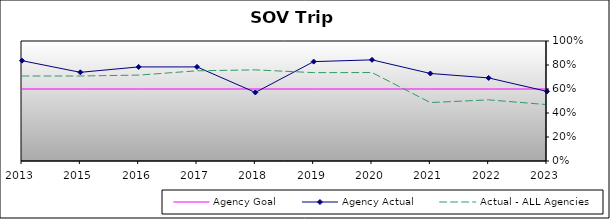
| Category | Agency Goal | Agency Actual | Actual - ALL Agencies |
|---|---|---|---|
| 2013.0 | 0.6 | 0.836 | 0.708 |
| 2015.0 | 0.6 | 0.739 | 0.708 |
| 2016.0 | 0.6 | 0.784 | 0.716 |
| 2017.0 | 0.6 | 0.784 | 0.752 |
| 2018.0 | 0.6 | 0.571 | 0.759 |
| 2019.0 | 0.6 | 0.828 | 0.736 |
| 2020.0 | 0.6 | 0.843 | 0.737 |
| 2021.0 | 0.6 | 0.729 | 0.487 |
| 2022.0 | 0.6 | 0.692 | 0.509 |
| 2023.0 | 0.6 | 0.58 | 0.47 |